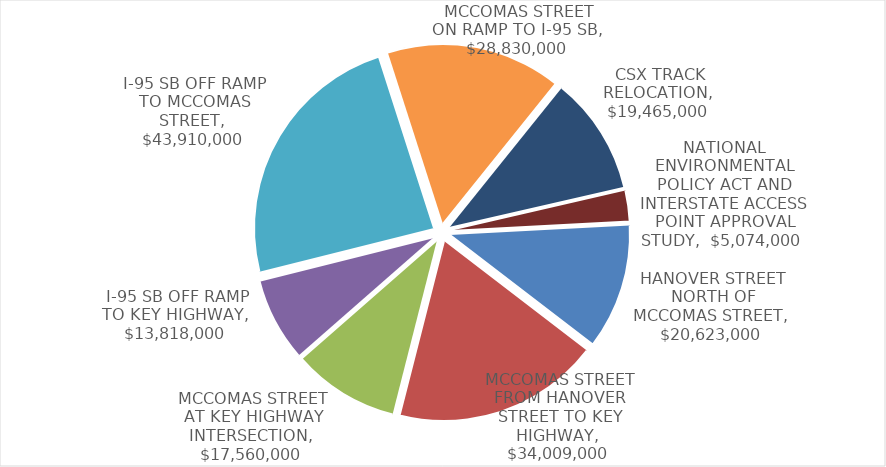
| Category | Series 0 |
|---|---|
| HANOVER STREET NORTH OF MCCOMAS STREET | 20623000 |
| MCCOMAS STREET FROM HANOVER STREET TO KEY HIGHWAY | 34009000 |
| MCCOMAS STREET AT KEY HIGHWAY INTERSECTION | 17560000 |
| I-95 SB OFF RAMP TO KEY HIGHWAY | 13818000 |
| I-95 SB OFF RAMP TO MCCOMAS STREET | 43910000 |
| MCCOMAS STREET ON RAMP TO I-95 SB | 28830000 |
| CSX TRACK RELOCATION | 19465000 |
| NATIONAL ENVIRONMENTAL POLICY ACT AND INTERSTATE ACCESS POINT APPROVAL STUDY | 5074000 |